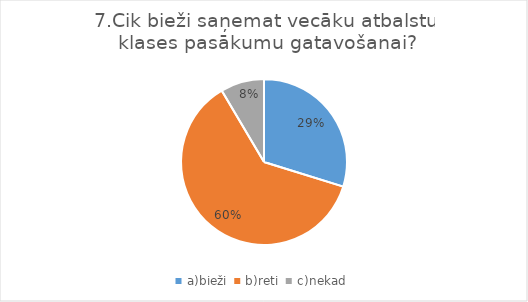
| Category | Series 0 |
|---|---|
| a)bieži  | 0.292 |
| b)reti  | 0.604 |
| c)nekad | 0.083 |